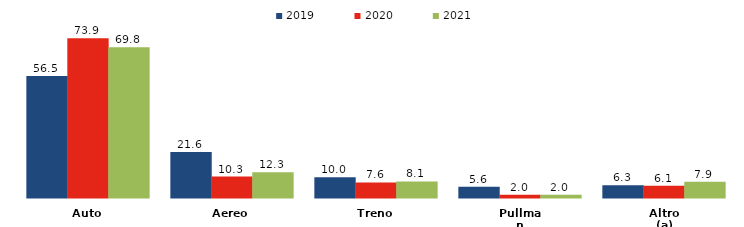
| Category | 2019 | 2020 | 2021 |
|---|---|---|---|
| Auto | 56.5 | 73.9 | 69.8 |
| Aereo | 21.6 | 10.3 | 12.3 |
| Treno | 10 | 7.6 | 8.1 |
| Pullman | 5.6 | 2 | 2 |
| Altro (a) | 6.3 | 6.1 | 7.9 |